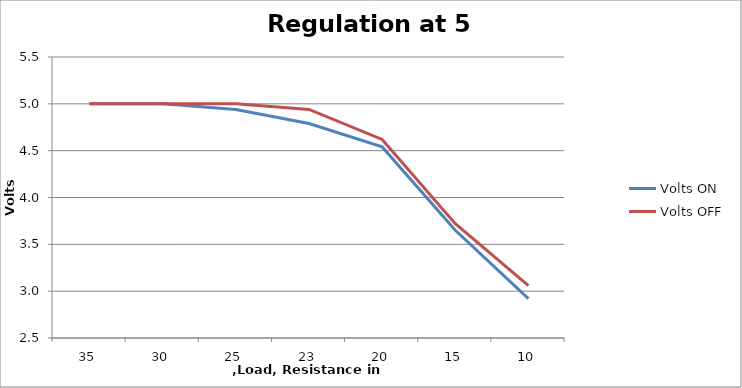
| Category | Volts ON | Volts OFF |
|---|---|---|
| 35.0 | 5 | 5 |
| 30.0 | 5 | 5 |
| 25.0 | 4.94 | 5 |
| 23.0 | 4.79 | 4.94 |
| 20.0 | 4.54 | 4.62 |
| 15.0 | 3.65 | 3.72 |
| 10.0 | 2.92 | 3.06 |